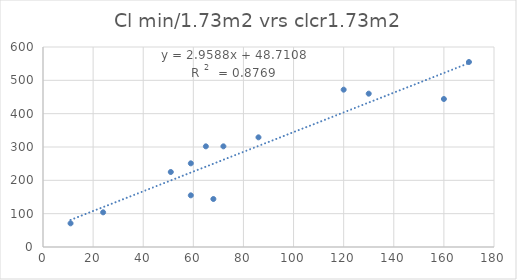
| Category | Series 0 |
|---|---|
| 72.0 | 302 |
| 11.0 | 71 |
| 68.0 | 144 |
| 24.0 | 104 |
| 51.0 | 225 |
| 59.0 | 155 |
| 120.0 | 472 |
| 65.0 | 302 |
| 130.0 | 460 |
| 170.0 | 555 |
| 160.0 | 444 |
| 59.0 | 251 |
| 86.0 | 329 |